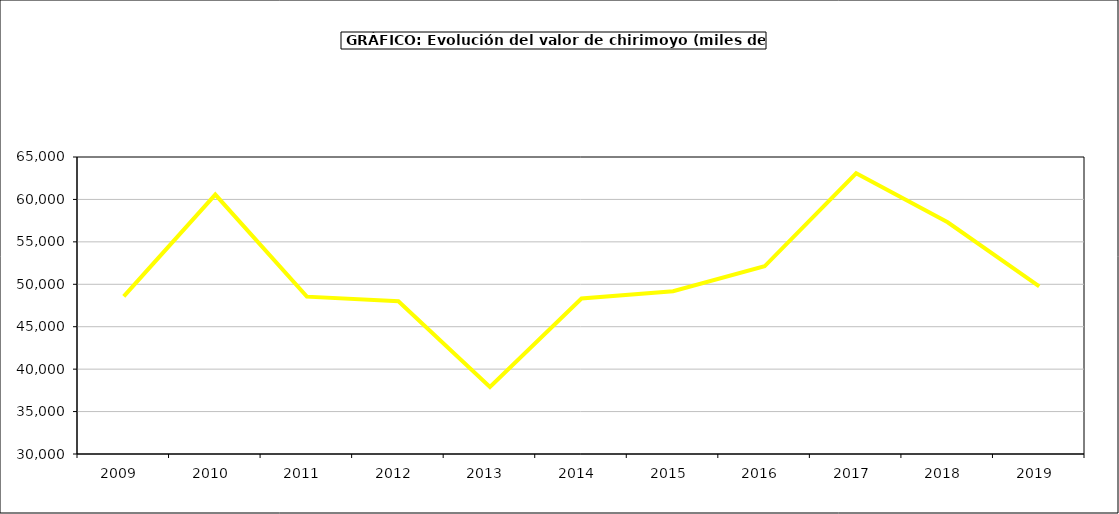
| Category | valor chirimoyo |
|---|---|
| 2009.0 | 48581.198 |
| 2010.0 | 60575.574 |
| 2011.0 | 48545.2 |
| 2012.0 | 47992.004 |
| 2013.0 | 37891.803 |
| 2014.0 | 48319.818 |
| 2015.0 | 49187 |
| 2016.0 | 52120 |
| 2017.0 | 63081.583 |
| 2018.0 | 57311.719 |
| 2019.0 | 49759.664 |